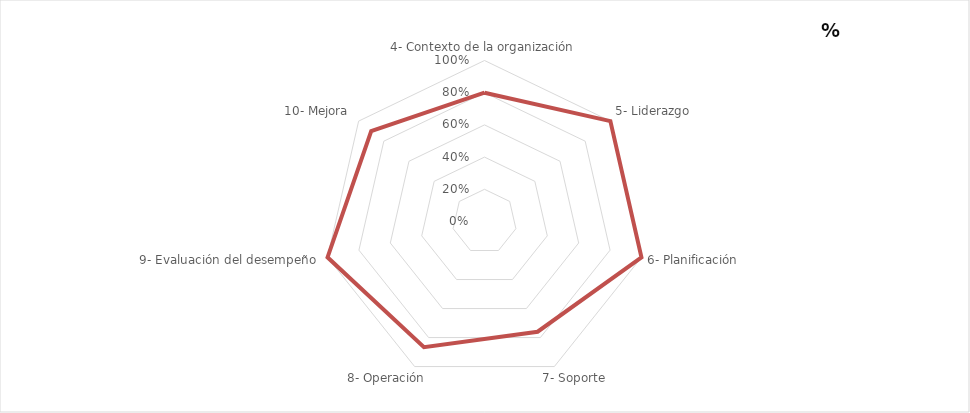
| Category | Series 0 |
|---|---|
| 4- Contexto de la organización | 0.8 |
| 5- Liderazgo | 1 |
| 6- Planificación | 1 |
| 7- Soporte | 0.76 |
| 8- Operación | 0.867 |
| 9- Evaluación del desempeño | 1 |
| 10- Mejora | 0.9 |